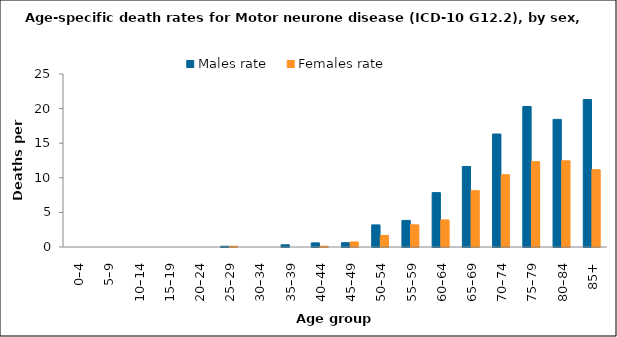
| Category | Males rate | Females rate |
|---|---|---|
| 0–4 | 0 | 0 |
| 5–9 | 0 | 0 |
| 10–14 | 0 | 0 |
| 15–19 | 0 | 0 |
| 20–24 | 0 | 0 |
| 25–29 | 0.108 | 0.111 |
| 30–34 | 0 | 0 |
| 35–39 | 0.319 | 0 |
| 40–44 | 0.594 | 0.116 |
| 45–49 | 0.623 | 0.732 |
| 50–54 | 3.194 | 1.667 |
| 55–59 | 3.843 | 3.204 |
| 60–64 | 7.856 | 3.912 |
| 65–69 | 11.637 | 8.141 |
| 70–74 | 16.329 | 10.442 |
| 75–79 | 20.302 | 12.33 |
| 80–84 | 18.441 | 12.451 |
| 85+ | 21.314 | 11.166 |